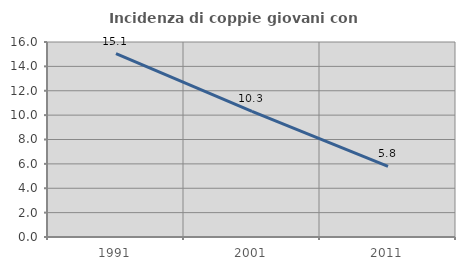
| Category | Incidenza di coppie giovani con figli |
|---|---|
| 1991.0 | 15.054 |
| 2001.0 | 10.305 |
| 2011.0 | 5.789 |